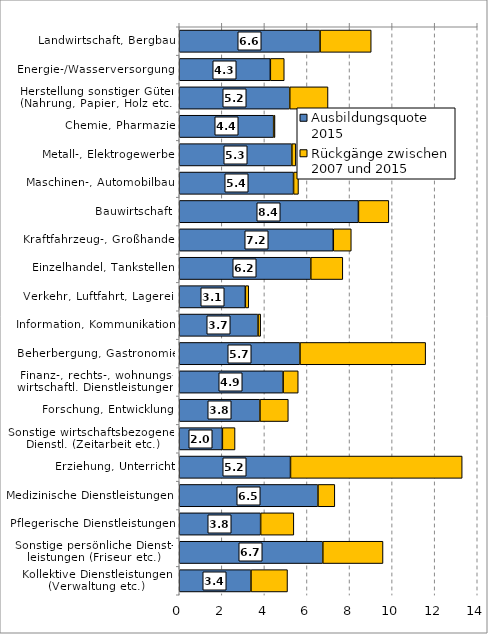
| Category | Ausbildungsquote 2015 | Rückgänge zwischen 2007 und 2015 |
|---|---|---|
| Landwirtschaft, Bergbau | 6.615 | 2.404 |
| Energie-/Wasserversorgung  | 4.279 | 0.655 |
| Herstellung sonstiger Güter
(Nahrung, Papier, Holz etc.) | 5.192 | 1.797 |
| Chemie, Pharmazie | 4.436 | 0.062 |
| Metall-, Elektrogewerbe | 5.29 | 0.188 |
| Maschinen-, Automobilbau | 5.37 | 0.232 |
| Bauwirtschaft | 8.418 | 1.429 |
| Kraftfahrzeug-, Großhandel | 7.237 | 0.845 |
| Einzelhandel, Tankstellen | 6.179 | 1.504 |
| Verkehr, Luftfahrt, Lagerei  | 3.106 | 0.158 |
| Information, Kommunikation | 3.7 | 0.125 |
| Beherbergung, Gastronomie | 5.671 | 5.904 |
| Finanz-, rechts-, wohnungs-
wirtschaftl. Dienstleistungen | 4.88 | 0.71 |
| Forschung, Entwicklung | 3.791 | 1.332 |
| Sonstige wirtschaftsbezogene
 Dienstl. (Zeitarbeit etc.) | 2.026 | 0.595 |
| Erziehung, Unterricht | 5.226 | 8.066 |
| Medizinische Dienstleistungen | 6.516 | 0.793 |
| Pflegerische Dienstleistungen | 3.823 | 1.56 |
| Sonstige persönliche Dienst-
leistungen (Friseur etc.) | 6.744 | 2.828 |
| Kollektive Dienstleistungen
(Verwaltung etc.) | 3.369 | 1.717 |